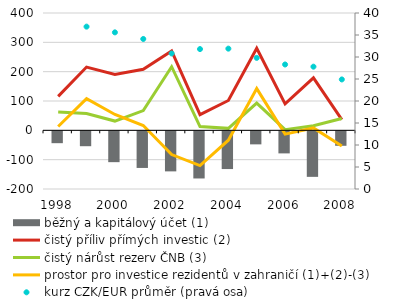
| Category | běžný a kapitálový účet (1) |
|---|---|
| 1998.0 | -40.4 |
| 1999.0 | -50.7 |
| 2000.0 | -105.1 |
| 2001.0 | -124.8 |
| 2002.0 | -136.5 |
| 2003.0 | -160.7 |
| 2004.0 | -128.6 |
| 2005.0 | -44.4 |
| 2006.0 | -75.2 |
| 2007.0 | -155.2 |
| 2008.0 | -49.3 |